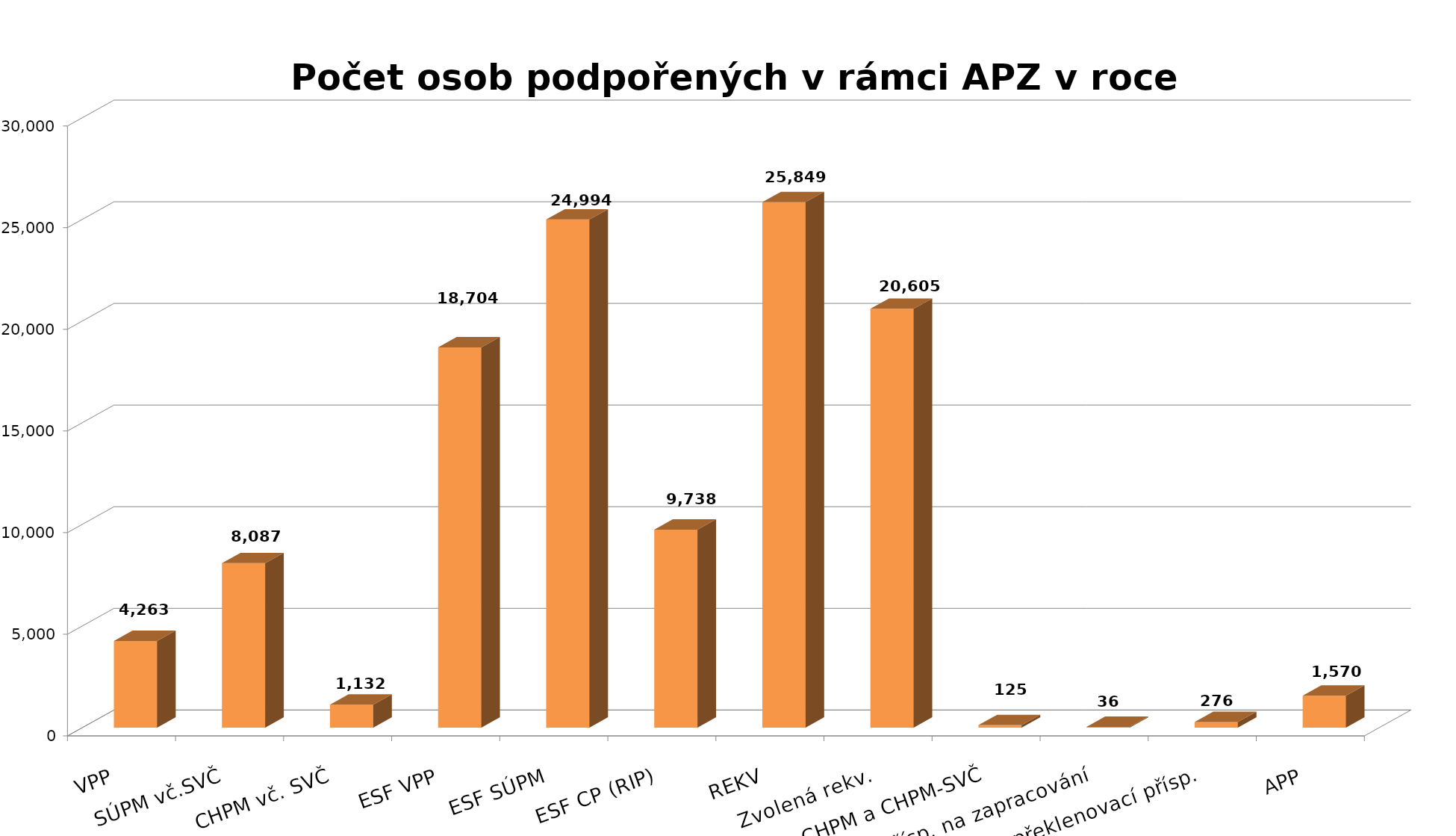
| Category | Series 0 |
|---|---|
| VPP | 4263 |
| SÚPM vč.SVČ | 8087 |
| CHPM vč. SVČ | 1132 |
| ESF VPP | 18704 |
| ESF SÚPM | 24994 |
| ESF CP (RIP) | 9738 |
| REKV | 25849 |
| Zvolená rekv. | 20605 |
| přísp. na provoz CHPM a CHPM-SVČ | 125 |
| přísp. na zapracování | 36 |
| překlenovací přísp. | 276 |
| APP | 1570 |